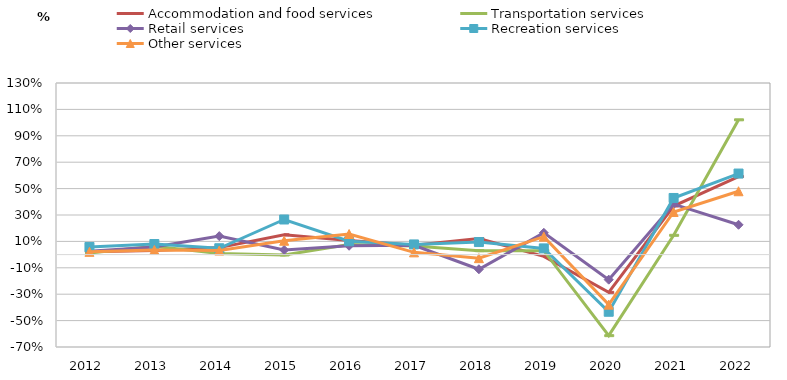
| Category | Accommodation and food services | Transportation services | Retail services | Recreation services | Other services |
|---|---|---|---|---|---|
| 2012.0 | 0.021 | 0.013 | 0.026 | 0.058 | 0.021 |
| 2013.0 | 0.031 | 0.063 | 0.058 | 0.08 | 0.035 |
| 2014.0 | 0.053 | 0.008 | 0.14 | 0.048 | 0.031 |
| 2015.0 | 0.15 | -0.003 | 0.035 | 0.266 | 0.105 |
| 2016.0 | 0.107 | 0.076 | 0.067 | 0.101 | 0.156 |
| 2017.0 | 0.071 | 0.065 | 0.07 | 0.077 | 0.017 |
| 2018.0 | 0.121 | 0.03 | -0.111 | 0.095 | -0.027 |
| 2019.0 | -0.013 | 0.03 | 0.165 | 0.047 | 0.136 |
| 2020.0 | -0.286 | -0.614 | -0.19 | -0.433 | -0.379 |
| 2021.0 | 0.368 | 0.146 | 0.382 | 0.429 | 0.323 |
| 2022.0 | 0.591 | 1.021 | 0.226 | 0.614 | 0.48 |